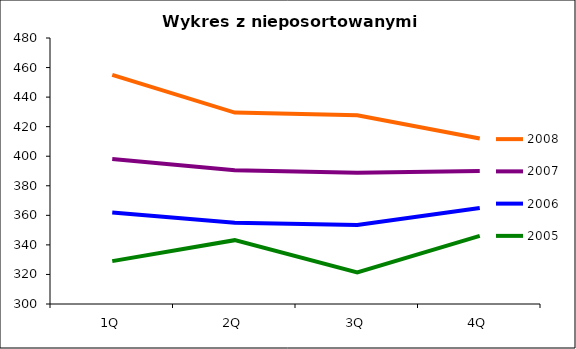
| Category | 2008 | 2007 | 2006 | 2005 |
|---|---|---|---|---|
| 1Q | 455 | 398.09 | 361.9 | 329 |
| 2Q | 429.55 | 390.5 | 355 | 343.2 |
| 3Q | 427.717 | 388.834 | 353.485 | 321.35 |
| 4Q | 412 | 390 | 365 | 346.05 |